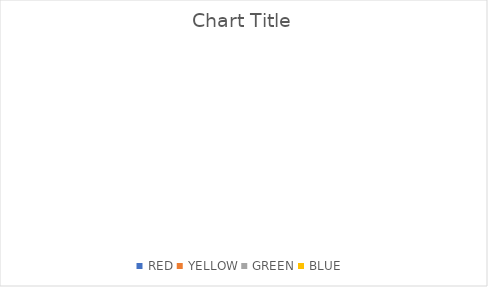
| Category | Series 0 |
|---|---|
| RED | 0 |
| YELLOW | 0 |
| GREEN | 0 |
| BLUE | 0 |